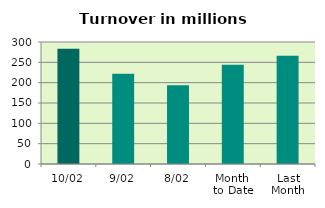
| Category | Series 0 |
|---|---|
| 10/02 | 283.29 |
| 9/02 | 222.096 |
| 8/02 | 193.891 |
| Month 
to Date | 243.92 |
| Last
Month | 265.89 |